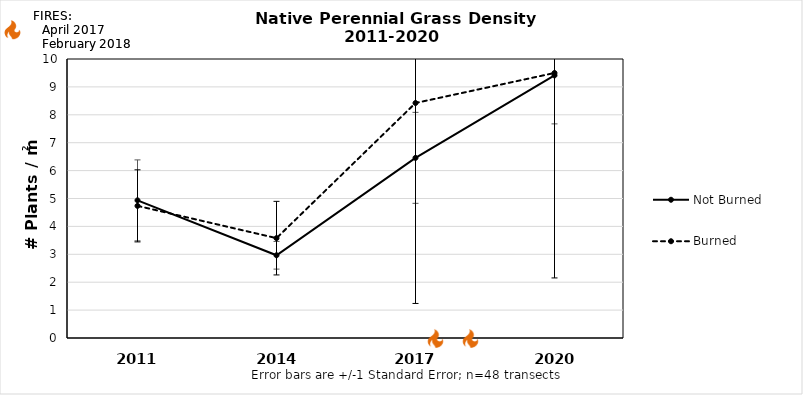
| Category | Not Burned | Burned |
|---|---|---|
| 2011.0 | 4.933 | 4.736 |
| 2014.0 | 2.965 | 3.579 |
| 2017.0 | 6.457 | 8.423 |
| 2020.0 | 9.413 | 9.499 |